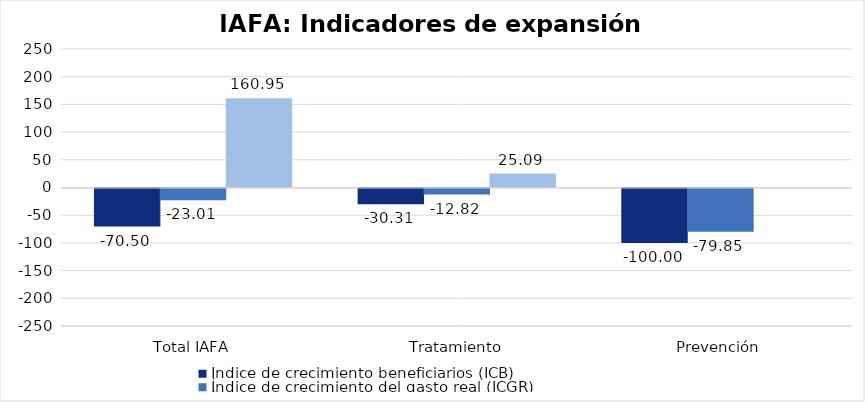
| Category | Índice de crecimiento beneficiarios (ICB)  | Índice de crecimiento del gasto real (ICGR)  | Índice de crecimiento del gasto real por beneficiario (ICGRB)  |
|---|---|---|---|
| Total IAFA | -70.496 | -23.009 | 160.954 |
| Tratamiento | -30.31 | -12.825 | 25.09 |
| Prevención | -100 | -79.852 | 0 |